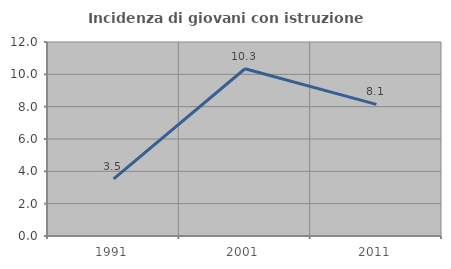
| Category | Incidenza di giovani con istruzione universitaria |
|---|---|
| 1991.0 | 3.529 |
| 2001.0 | 10.345 |
| 2011.0 | 8.14 |